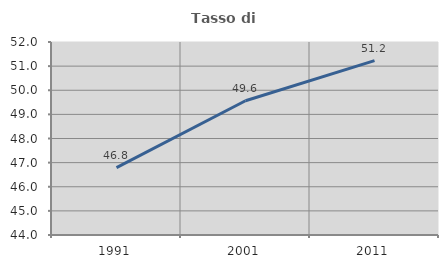
| Category | Tasso di occupazione   |
|---|---|
| 1991.0 | 46.793 |
| 2001.0 | 49.564 |
| 2011.0 | 51.227 |